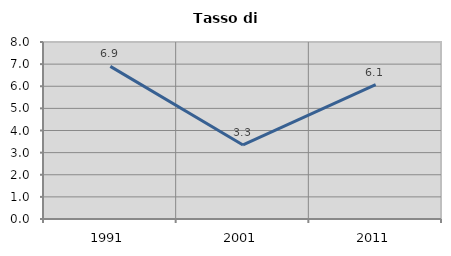
| Category | Tasso di disoccupazione   |
|---|---|
| 1991.0 | 6.897 |
| 2001.0 | 3.347 |
| 2011.0 | 6.073 |